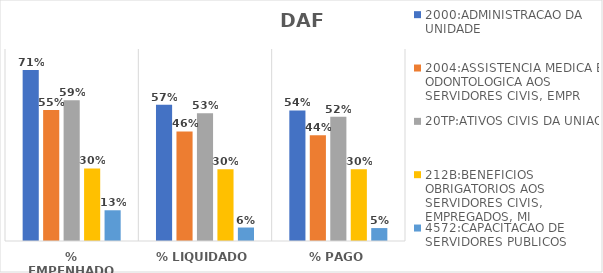
| Category | 2000:ADMINISTRACAO DA UNIDADE | 2004:ASSISTENCIA MEDICA E ODONTOLOGICA AOS SERVIDORES CIVIS, EMPR | 20TP:ATIVOS CIVIS DA UNIAO | 212B:BENEFICIOS OBRIGATORIOS AOS SERVIDORES CIVIS, EMPREGADOS, MI | 4572:CAPACITACAO DE SERVIDORES PUBLICOS FEDERAIS EM PROCESSO DE Q |
|---|---|---|---|---|---|
| % EMPENHADO | 0.712 | 0.545 | 0.587 | 0.303 | 0.128 |
| % LIQUIDADO | 0.567 | 0.457 | 0.532 | 0.299 | 0.056 |
| % PAGO | 0.544 | 0.441 | 0.517 | 0.299 | 0.054 |